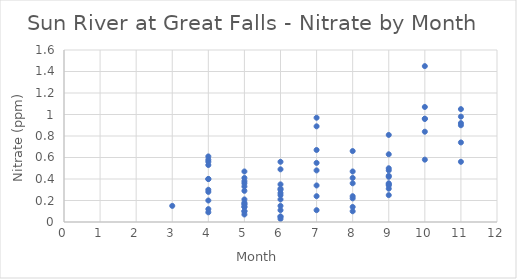
| Category | Series 0 |
|---|---|
| 9.0 | 0.42 |
| 8.0 | 0.1 |
| 7.0 | 0.11 |
| 9.0 | 0.31 |
| 8.0 | 0.14 |
| 7.0 | 0.24 |
| 9.0 | 0.34 |
| 8.0 | 0.41 |
| 8.0 | 0.36 |
| 9.0 | 0.5 |
| 7.0 | 0.34 |
| 9.0 | 0.48 |
| 9.0 | 0.81 |
| 9.0 | 0.35 |
| 8.0 | 0.22 |
| 7.0 | 0.55 |
| 9.0 | 0.25 |
| 8.0 | 0.47 |
| 7.0 | 0.48 |
| 9.0 | 0.36 |
| 8.0 | 0.24 |
| 7.0 | 0.67 |
| 9.0 | 0.63 |
| 7.0 | 0.89 |
| 9.0 | 0.43 |
| 8.0 | 0.66 |
| 7.0 | 0.97 |
| 11.0 | 0.56 |
| 6.0 | 0.11 |
| 5.0 | 0.36 |
| 11.0 | 0.92 |
| 6.0 | 0.05 |
| 5.0 | 0.1 |
| 4.0 | 0.09 |
| 11.0 | 0.74 |
| 6.0 | 0.15 |
| 5.0 | 0.1 |
| 4.0 | 0.2 |
| 11.0 | 0.98 |
| 6.0 | 0.27 |
| 5.0 | 0.18 |
| 4.0 | 0.53 |
| 11.0 | 0.9 |
| 6.0 | 0.25 |
| 5.0 | 0.38 |
| 4.0 | 0.3 |
| 10.0 | 1.45 |
| 5.0 | 0.21 |
| 5.0 | 0.47 |
| 10.0 | 1.07 |
| 6.0 | 0.3 |
| 5.0 | 0.41 |
| 4.0 | 0.56 |
| 10.0 | 0.96 |
| 6.0 | 0.56 |
| 5.0 | 0.33 |
| 4.0 | 0.28 |
| 10.0 | 0.84 |
| 6.0 | 0.05 |
| 5.0 | 0.29 |
| 4.0 | 0.58 |
| 10.0 | 0.58 |
| 5.0 | 0.14 |
| 4.0 | 0.4 |
| 10.0 | 0.96 |
| 6.0 | 0.35 |
| 5.0 | 0.07 |
| 4.0 | 0.61 |
| 6.0 | 0.31 |
| 5.0 | 0.16 |
| 4.0 | 0.4 |
| 6.0 | 0.21 |
| 5.0 | 0.14 |
| 4.0 | 0.12 |
| 6.0 | 0.49 |
| 5.0 | 0.17 |
| 11.0 | 1.05 |
| 6.0 | 0.029 |
| 3.0 | 0.15 |